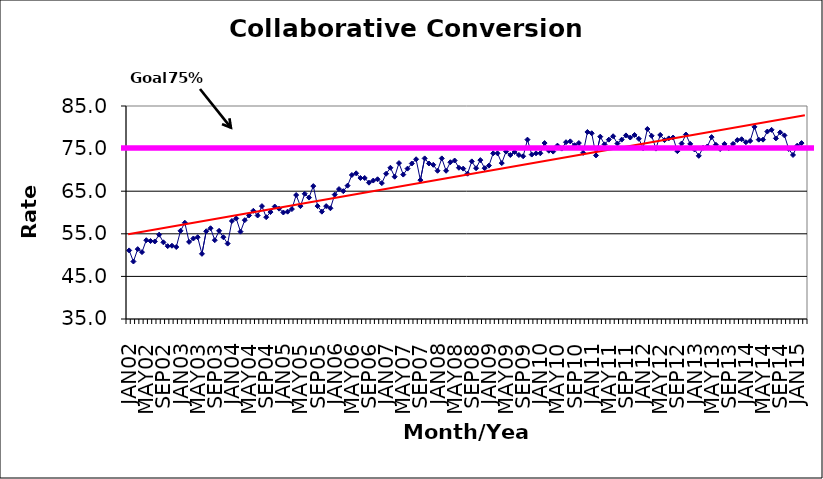
| Category | Series 0 |
|---|---|
| JAN02 | 51.1 |
| FEB02 | 48.5 |
| MAR02 | 51.4 |
| APR02 | 50.7 |
| MAY02 | 53.5 |
| JUN02 | 53.3 |
| JUL02 | 53.2 |
| AUG02 | 54.8 |
| SEP02 | 53 |
| OCT02 | 52.1 |
| NOV02 | 52.2 |
| DEC02 | 51.9 |
| JAN03 | 55.7 |
| FEB03 | 57.6 |
| MAR03 | 53.1 |
| APR03 | 53.9 |
| MAY03 | 54.2 |
| JUN03 | 50.3 |
| JUL03 | 55.6 |
| AUG03 | 56.3 |
| SEP03 | 53.5 |
| OCT03 | 55.7 |
| NOV03 | 54.2 |
| DEC03 | 52.7 |
| JAN04 | 58 |
| FEB04 | 58.6 |
| MAR04 | 55.5 |
| APR04 | 58.2 |
| MAY04 | 59.3 |
| JUN04 | 60.4 |
| JUL04 | 59.3 |
| AUG04 | 61.5 |
| SEP04 | 58.9 |
| OCT04 | 60.1 |
| NOV04 | 61.4 |
| DEC04 | 60.9 |
| JAN05 | 60 |
| FEB05 | 60.2 |
| MAR05 | 60.8 |
| APR05 | 64.1 |
| MAY05 | 61.5 |
| JUN05 | 64.4 |
| JUL05 | 63.5 |
| AUG05 | 66.2 |
| SEP05 | 61.5 |
| OCT05 | 60.2 |
| NOV05 | 61.5 |
| DEC05 | 61 |
| JAN06 | 64.2 |
| FEB06 | 65.5 |
| MAR06 | 65 |
| APR06 | 66.3 |
| MAY06 | 68.8 |
| JUN06 | 69.2 |
| JUL06 | 68.1 |
| AUG06 | 68.1 |
| SEP06 | 67 |
| OCT06 | 67.5 |
| NOV06 | 67.8 |
| DEC06 | 66.9 |
| JAN07 | 69.1 |
| FEB07 | 70.5 |
| MAR07 | 68.4 |
| APR07 | 71.6 |
| MAY07 | 68.9 |
| JUN07 | 70.3 |
| JUL07 | 71.5 |
| AUG07 | 72.5 |
| SEP07 | 67.6 |
| OCT07 | 72.7 |
| NOV07 | 71.5 |
| DEC07 | 71.2 |
| JAN08 | 69.8 |
| FEB08 | 72.7 |
| MAR08 | 69.8 |
| APR08 | 71.8 |
| MAY08 | 72.2 |
| JUN08 | 70.5 |
| JUL08 | 70.3 |
| AUG08 | 69.1 |
| SEP08 | 72 |
| OCT08 | 70.4 |
| NOV08 | 72.3 |
| DEC08 | 70.4 |
| JAN09 | 71 |
| FEB09 | 73.9 |
| MAR09 | 73.9 |
| APR09 | 71.6 |
| MAY09 | 74.3 |
| JUN09 | 73.5 |
| JUL09 | 74.2 |
| AUG09 | 73.5 |
| SEP09 | 73.2 |
| OCT09 | 77.1 |
| NOV09 | 73.6 |
| DEC09 | 73.9 |
| JAN10 | 73.9 |
| FEB10 | 76.3 |
| MAR10 | 74.5 |
| APR10 | 74.3 |
| MAY10 | 75.7 |
| JUN10 | 75 |
| JUL10 | 76.5 |
| AUG10 | 76.7 |
| SEP10 | 75.8 |
| OCT10 | 76.3 |
| NOV10 | 74 |
| DEC10 | 78.9 |
| JAN11 | 78.6 |
| FEB11 | 73.4 |
| MAR11 | 77.8 |
| APR11 | 76 |
| MAY11 | 77.1 |
| JUN11 | 77.9 |
| JUL11 | 76.2 |
| AUG11 | 77.1 |
| SEP11 | 78.1 |
| OCT11 | 77.6 |
| NOV11 | 78.2 |
| DEC11 | 77.3 |
| JAN12 | 75.1 |
| FEB12 | 79.6 |
| MAR12 | 78 |
| APR12 | 75 |
| MAY12 | 78.2 |
| JUN12 | 77 |
| JUL12 | 77.4 |
| AUG12 | 77.6 |
| SEP12 | 74.4 |
| OCT12 | 76.2 |
| NOV12 | 78.3 |
| DEC12 | 76.1 |
| JAN13 | 74.8 |
| FEB13 | 73.3 |
| MAR13 | 75.2 |
| APR13 | 75.5 |
| MAY13 | 77.7 |
| JUN13 | 75.9 |
| JUL13 | 74.9 |
| AUG13 | 76.1 |
| SEP13 | 75.1 |
| OCT13 | 76.1 |
| NOV13 | 77 |
| DEC13 | 77.2 |
| JAN14 | 76.5 |
| FEB14 | 76.8 |
| MAR14 | 80.1 |
| APR14 | 77.1 |
| MAY14 | 77.1 |
| JUN14 | 79 |
| JUL14 | 79.4 |
| AUG14 | 77.4 |
| SEP14 | 78.8 |
| OCT14 | 78.1 |
| NOV14 | 74.9 |
| DEC14 | 73.5 |
| JAN15 | 75.7 |
| FEB15 | 76.3 |